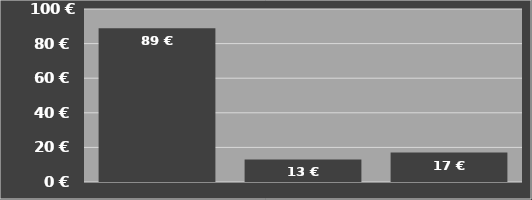
| Category | Kosten je Hektar
inklusive Schlepper |
|---|---|
| Krone BigX 850
EasyCollect 750-2 (Mais) | 88.941 |
| Easy Flow 300 S
Pickup 2,8 Meter | 13.023 |
| XDisc 620
GPS 6 Meter | 17.004 |